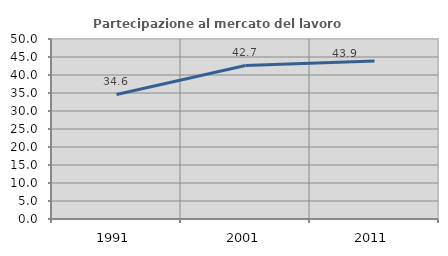
| Category | Partecipazione al mercato del lavoro  femminile |
|---|---|
| 1991.0 | 34.597 |
| 2001.0 | 42.661 |
| 2011.0 | 43.918 |